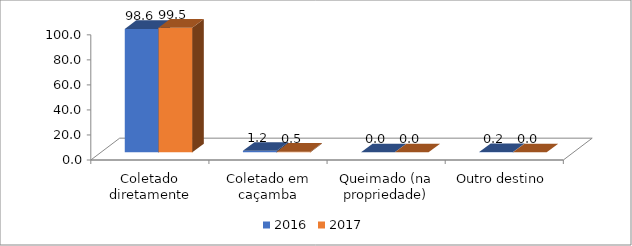
| Category | 2016 | 2017 |
|---|---|---|
| Coletado diretamente | 98.6 | 99.5 |
| Coletado em caçamba | 1.2 | 0.5 |
| Queimado (na propriedade) | 0 | 0 |
| Outro destino | 0.2 | 0 |